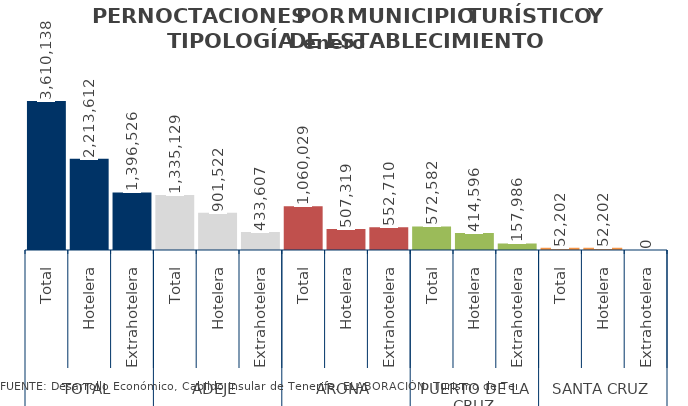
| Category | enero 2014 |
|---|---|
| 0 | 3610138 |
| 1 | 2213612 |
| 2 | 1396526 |
| 3 | 1335129 |
| 4 | 901522 |
| 5 | 433607 |
| 6 | 1060029 |
| 7 | 507319 |
| 8 | 552710 |
| 9 | 572582 |
| 10 | 414596 |
| 11 | 157986 |
| 12 | 52202 |
| 13 | 52202 |
| 14 | 0 |